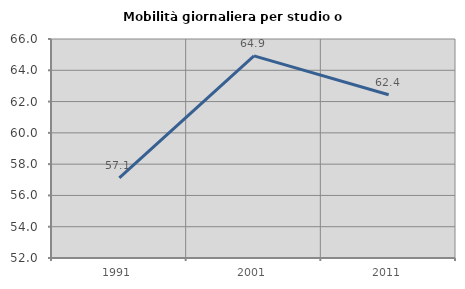
| Category | Mobilità giornaliera per studio o lavoro |
|---|---|
| 1991.0 | 57.127 |
| 2001.0 | 64.923 |
| 2011.0 | 62.439 |